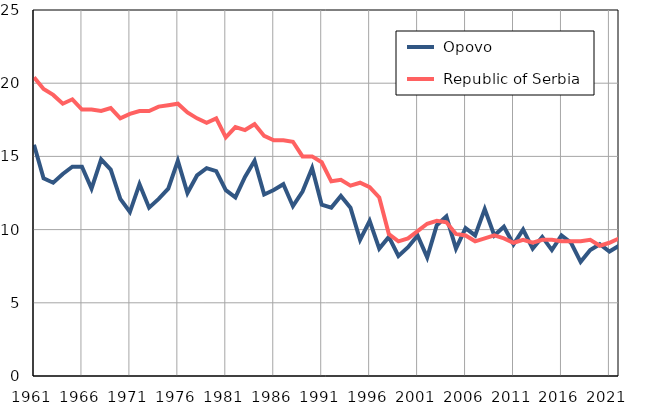
| Category |  Opovo |  Republic of Serbia |
|---|---|---|
| 1961.0 | 15.8 | 20.4 |
| 1962.0 | 13.5 | 19.6 |
| 1963.0 | 13.2 | 19.2 |
| 1964.0 | 13.8 | 18.6 |
| 1965.0 | 14.3 | 18.9 |
| 1966.0 | 14.3 | 18.2 |
| 1967.0 | 12.8 | 18.2 |
| 1968.0 | 14.8 | 18.1 |
| 1969.0 | 14.1 | 18.3 |
| 1970.0 | 12.1 | 17.6 |
| 1971.0 | 11.2 | 17.9 |
| 1972.0 | 13.1 | 18.1 |
| 1973.0 | 11.5 | 18.1 |
| 1974.0 | 12.1 | 18.4 |
| 1975.0 | 12.8 | 18.5 |
| 1976.0 | 14.7 | 18.6 |
| 1977.0 | 12.5 | 18 |
| 1978.0 | 13.7 | 17.6 |
| 1979.0 | 14.2 | 17.3 |
| 1980.0 | 14 | 17.6 |
| 1981.0 | 12.7 | 16.3 |
| 1982.0 | 12.2 | 17 |
| 1983.0 | 13.6 | 16.8 |
| 1984.0 | 14.7 | 17.2 |
| 1985.0 | 12.4 | 16.4 |
| 1986.0 | 12.7 | 16.1 |
| 1987.0 | 13.1 | 16.1 |
| 1988.0 | 11.6 | 16 |
| 1989.0 | 12.6 | 15 |
| 1990.0 | 14.2 | 15 |
| 1991.0 | 11.7 | 14.6 |
| 1992.0 | 11.5 | 13.3 |
| 1993.0 | 12.3 | 13.4 |
| 1994.0 | 11.5 | 13 |
| 1995.0 | 9.3 | 13.2 |
| 1996.0 | 10.6 | 12.9 |
| 1997.0 | 8.7 | 12.2 |
| 1998.0 | 9.5 | 9.7 |
| 1999.0 | 8.2 | 9.2 |
| 2000.0 | 8.8 | 9.4 |
| 2001.0 | 9.6 | 9.9 |
| 2002.0 | 8.1 | 10.4 |
| 2003.0 | 10.3 | 10.6 |
| 2004.0 | 10.9 | 10.5 |
| 2005.0 | 8.7 | 9.7 |
| 2006.0 | 10.1 | 9.6 |
| 2007.0 | 9.6 | 9.2 |
| 2008.0 | 11.4 | 9.4 |
| 2009.0 | 9.6 | 9.6 |
| 2010.0 | 10.2 | 9.4 |
| 2011.0 | 9 | 9.1 |
| 2012.0 | 10 | 9.3 |
| 2013.0 | 8.7 | 9.1 |
| 2014.0 | 9.5 | 9.3 |
| 2015.0 | 8.6 | 9.3 |
| 2016.0 | 9.6 | 9.2 |
| 2017.0 | 9.1 | 9.2 |
| 2018.0 | 7.8 | 9.2 |
| 2019.0 | 8.6 | 9.3 |
| 2020.0 | 9 | 8.9 |
| 2021.0 | 8.5 | 9.1 |
| 2022.0 | 8.9 | 9.4 |